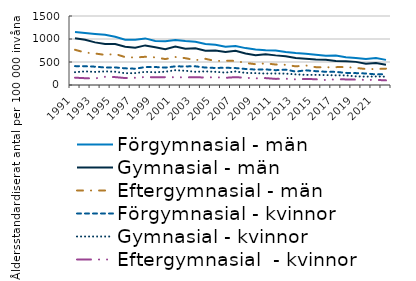
| Category | Förgymnasial - män | Gymnasial - män | Eftergymnasial - män | Förgymnasial - kvinnor | Gymnasial - kvinnor | Eftergymnasial  - kvinnor |
|---|---|---|---|---|---|---|
| 1991.0 | 1152.806 | 1017.938 | 765.487 | 410.336 | 279.065 | 158.897 |
| 1992.0 | 1131.758 | 982.4 | 705.918 | 408.366 | 295.793 | 148.143 |
| 1993.0 | 1110.707 | 926.411 | 684.941 | 398.246 | 284.228 | 142.753 |
| 1994.0 | 1091.267 | 891.151 | 654.108 | 380.08 | 296.362 | 178.398 |
| 1995.0 | 1050.037 | 889.577 | 675.19 | 382.149 | 288.916 | 171.415 |
| 1996.0 | 985.212 | 831.158 | 606.154 | 362.421 | 255.566 | 151.151 |
| 1997.0 | 983.962 | 808.598 | 597.603 | 354.448 | 259.37 | 157.473 |
| 1998.0 | 1013.012 | 860.823 | 613.213 | 389.401 | 285.85 | 173.142 |
| 1999.0 | 958.549 | 820.444 | 601.276 | 390.806 | 276.519 | 166.232 |
| 2000.0 | 950.596 | 779.803 | 563.359 | 377.622 | 289.137 | 169.809 |
| 2001.0 | 976.037 | 835.867 | 609.099 | 405.368 | 321.095 | 169.114 |
| 2002.0 | 953.972 | 788.196 | 583.189 | 404.256 | 309.789 | 165.143 |
| 2003.0 | 938.95 | 798.234 | 539.495 | 406.219 | 286.869 | 169.014 |
| 2004.0 | 891.014 | 746.289 | 569.022 | 378.724 | 296.4 | 162.79 |
| 2005.0 | 875.72 | 749.513 | 521.187 | 370.25 | 285.961 | 169.728 |
| 2006.0 | 832.124 | 718.749 | 527.989 | 374.856 | 270.281 | 156.179 |
| 2007.0 | 847.547 | 744.887 | 524.368 | 368.277 | 294.184 | 170.904 |
| 2008.0 | 801.905 | 686.354 | 478.974 | 348.418 | 263.024 | 156.704 |
| 2009.0 | 773.064 | 647.13 | 451.688 | 336.005 | 258.365 | 144.058 |
| 2010.0 | 755.551 | 668.226 | 469.789 | 338.439 | 249.584 | 149.954 |
| 2011.0 | 749.068 | 643.963 | 445.357 | 322.041 | 250.642 | 132.788 |
| 2012.0 | 718.138 | 626.546 | 438.819 | 334.267 | 247.837 | 136.928 |
| 2013.0 | 695.471 | 585.919 | 405.545 | 292.09 | 230.649 | 121.985 |
| 2014.0 | 679.505 | 572.458 | 424.472 | 319.111 | 220.471 | 132.954 |
| 2015.0 | 659.651 | 554.869 | 387.915 | 300.628 | 219.908 | 124.852 |
| 2016.0 | 638.097 | 548.507 | 383.588 | 287.768 | 215.405 | 108.043 |
| 2017.0 | 642.056 | 520.398 | 388.318 | 285.184 | 210.174 | 124.303 |
| 2018.0 | 603.781 | 517.934 | 390.35 | 263.763 | 208.938 | 122.015 |
| 2019.0 | 589.113 | 502.853 | 371.819 | 258.259 | 187.89 | 117.192 |
| 2020.0 | 564.983 | 461.099 | 346.797 | 250.839 | 181.666 | 110.832 |
| 2021.0 | 584.223 | 479.596 | 347.142 | 230.081 | 186.36 | 111.355 |
| 2022.0 | 546.319 | 439.983 | 355.645 | 235.379 | 180.596 | 100.526 |